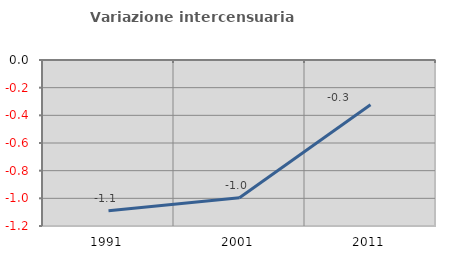
| Category | Variazione intercensuaria annua |
|---|---|
| 1991.0 | -1.09 |
| 2001.0 | -0.996 |
| 2011.0 | -0.323 |